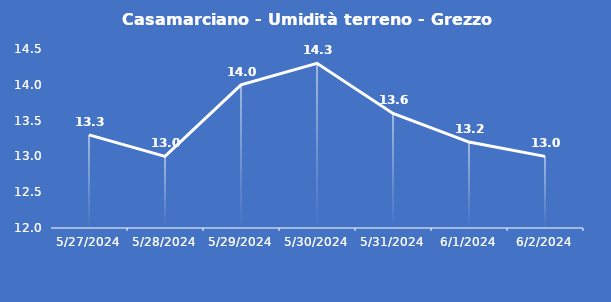
| Category | Casamarciano - Umidità terreno - Grezzo (%VWC) |
|---|---|
| 5/27/24 | 13.3 |
| 5/28/24 | 13 |
| 5/29/24 | 14 |
| 5/30/24 | 14.3 |
| 5/31/24 | 13.6 |
| 6/1/24 | 13.2 |
| 6/2/24 | 13 |